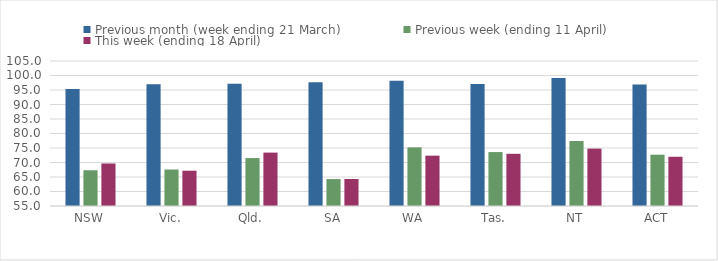
| Category | Previous month (week ending 21 March) | Previous week (ending 11 April) | This week (ending 18 April) |
|---|---|---|---|
| NSW | 95.376 | 67.328 | 69.662 |
| Vic. | 96.997 | 67.578 | 67.172 |
| Qld. | 97.135 | 71.524 | 73.416 |
| SA | 97.676 | 64.282 | 64.301 |
| WA | 98.152 | 75.216 | 72.361 |
| Tas. | 97.084 | 73.597 | 73 |
| NT | 99.106 | 77.381 | 74.794 |
| ACT | 96.873 | 72.687 | 71.979 |